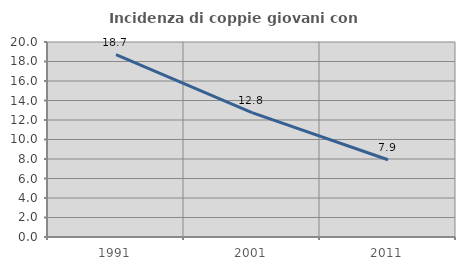
| Category | Incidenza di coppie giovani con figli |
|---|---|
| 1991.0 | 18.706 |
| 2001.0 | 12.755 |
| 2011.0 | 7.923 |